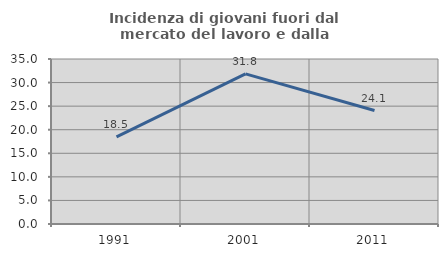
| Category | Incidenza di giovani fuori dal mercato del lavoro e dalla formazione  |
|---|---|
| 1991.0 | 18.495 |
| 2001.0 | 31.835 |
| 2011.0 | 24.064 |